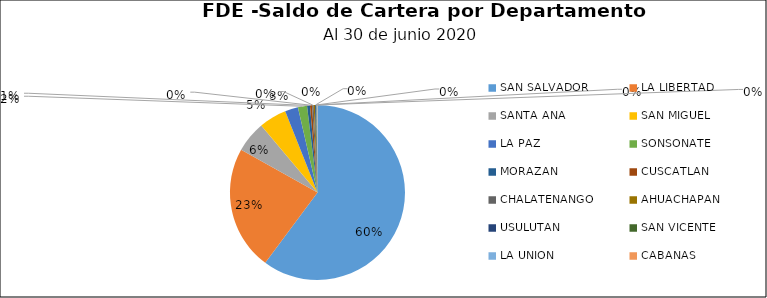
| Category | Saldo | Créditos |
|---|---|---|
| SAN SALVADOR | 31.561 | 409 |
| LA LIBERTAD | 12.024 | 154 |
| SANTA ANA | 3.032 | 30 |
| SAN MIGUEL | 2.672 | 26 |
| LA PAZ | 1.267 | 16 |
| SONSONATE | 0.886 | 29 |
| MORAZAN | 0.279 | 6 |
| CUSCATLAN | 0.203 | 19 |
| CHALATENANGO | 0.153 | 12 |
| AHUACHAPAN | 0.128 | 10 |
| USULUTAN | 0.083 | 10 |
| SAN VICENTE | 0.067 | 3 |
| LA UNION | 0.062 | 5 |
| CABAÑAS | 0.027 | 8 |